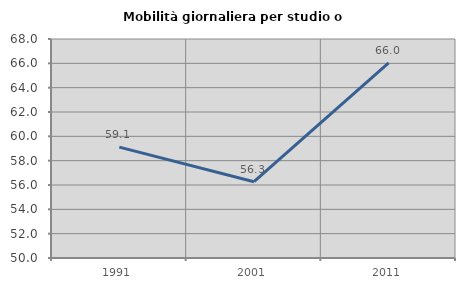
| Category | Mobilità giornaliera per studio o lavoro |
|---|---|
| 1991.0 | 59.112 |
| 2001.0 | 56.27 |
| 2011.0 | 66.045 |